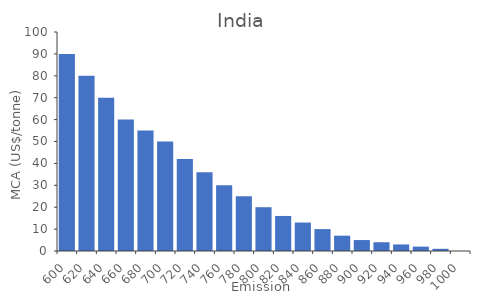
| Category | TCA (million $) |
|---|---|
| 600.0 | 90 |
| 620.0 | 80 |
| 640.0 | 70 |
| 660.0 | 60 |
| 680.0 | 55 |
| 700.0 | 50 |
| 720.0 | 42 |
| 740.0 | 36 |
| 760.0 | 30 |
| 780.0 | 25 |
| 800.0 | 20 |
| 820.0 | 16 |
| 840.0 | 13 |
| 860.0 | 10 |
| 880.0 | 7 |
| 900.0 | 5 |
| 920.0 | 4 |
| 940.0 | 3 |
| 960.0 | 2 |
| 980.0 | 1 |
| 1000.0 | 0 |